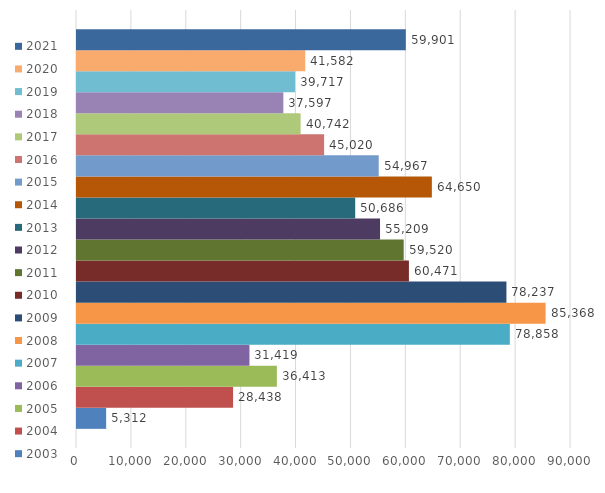
| Category | 2003 | 2004 | 2005 | 2006 | 2007 | 2008 | 2009 | 2010 | 2011 | 2012 | 2013 | 2014 | 2015 | 2016 | 2017 | 2018 | 2019 | 2020 | 2021 |
|---|---|---|---|---|---|---|---|---|---|---|---|---|---|---|---|---|---|---|---|
| 0 | 5312 | 28438 | 36413 | 31419 | 78858 | 85368 | 78237 | 60471 | 59520 | 55209 | 50686 | 64650 | 54967 | 45020 | 40742 | 37597 | 39717 | 41582 | 59901 |